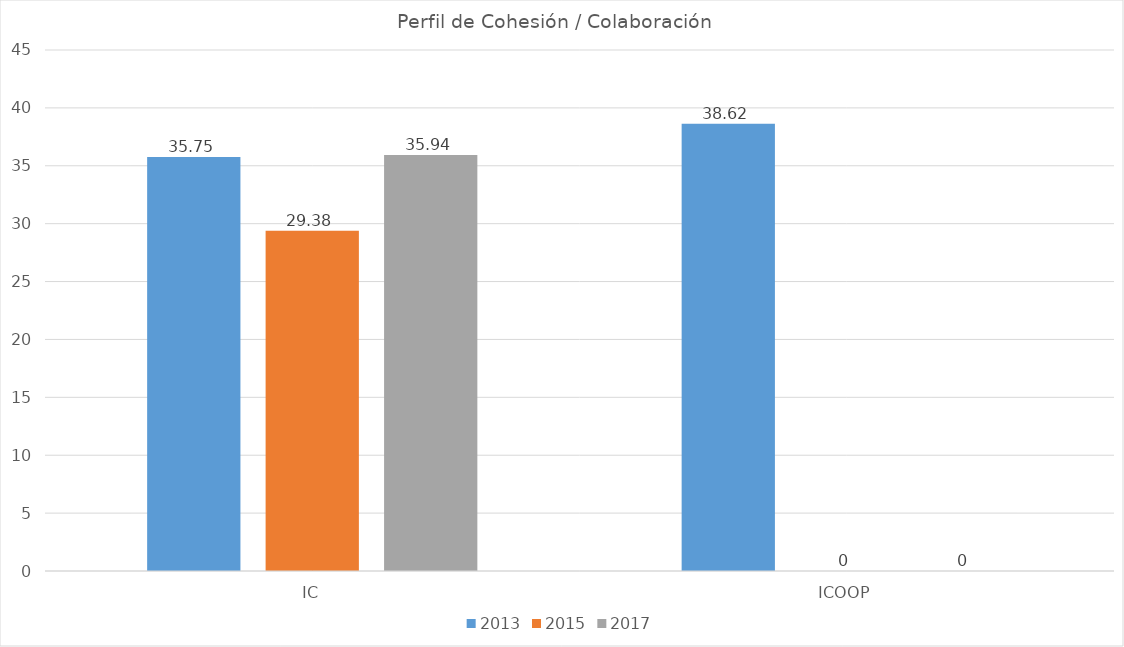
| Category | 2013 | 2015 | 2017 |
|---|---|---|---|
| IC | 35.75 | 29.38 | 35.94 |
| ICOOP | 38.62 | 0 | 0 |